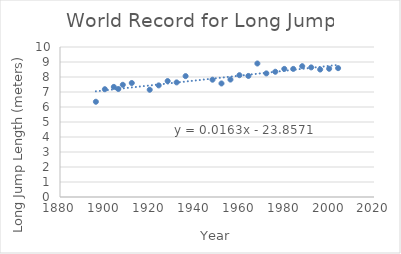
| Category | Series 0 |
|---|---|
| 1896.0 | 6.35 |
| 1900.0 | 7.185 |
| 1904.0 | 7.34 |
| 1906.0 | 7.2 |
| 1908.0 | 7.48 |
| 1912.0 | 7.6 |
| 1920.0 | 7.15 |
| 1924.0 | 7.44 |
| 1928.0 | 7.73 |
| 1932.0 | 7.64 |
| 1936.0 | 8.06 |
| 1948.0 | 7.82 |
| 1952.0 | 7.57 |
| 1956.0 | 7.83 |
| 1960.0 | 8.12 |
| 1964.0 | 8.07 |
| 1968.0 | 8.9 |
| 1972.0 | 8.24 |
| 1976.0 | 8.35 |
| 1980.0 | 8.54 |
| 1984.0 | 8.54 |
| 1988.0 | 8.72 |
| 1992.0 | 8.64 |
| 1996.0 | 8.5 |
| 2000.0 | 8.55 |
| 2004.0 | 8.59 |